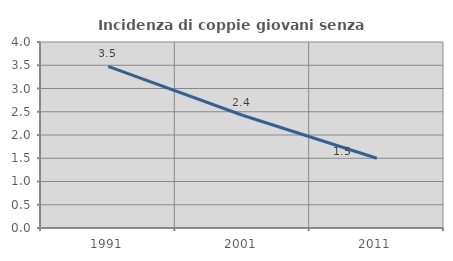
| Category | Incidenza di coppie giovani senza figli |
|---|---|
| 1991.0 | 3.476 |
| 2001.0 | 2.424 |
| 2011.0 | 1.5 |